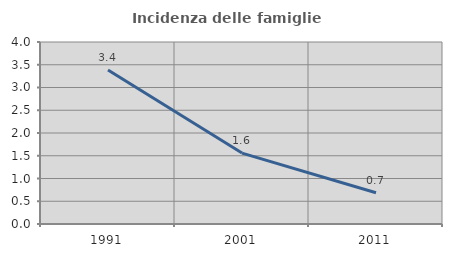
| Category | Incidenza delle famiglie numerose |
|---|---|
| 1991.0 | 3.384 |
| 2001.0 | 1.559 |
| 2011.0 | 0.688 |